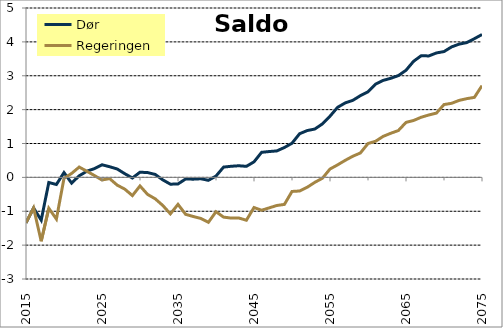
| Category | Dør | Regeringen |
|---|---|---|
| 2015-01-01 | -1.343 | -1.343 |
| 2016-01-01 | -0.903 | -0.903 |
| 2017-01-01 | -1.263 | -1.886 |
| 2018-01-01 | -0.152 | -0.91 |
| 2019-01-01 | -0.21 | -1.23 |
| 2020-01-01 | 0.142 | -0.028 |
| 2021-01-01 | -0.169 | 0.116 |
| 2022-01-01 | 0.046 | 0.305 |
| 2023-01-01 | 0.182 | 0.182 |
| 2024-01-01 | 0.257 | 0.055 |
| 2025-01-01 | 0.372 | -0.077 |
| 2026-01-01 | 0.314 | -0.036 |
| 2027-01-01 | 0.248 | -0.229 |
| 2028-01-01 | 0.108 | -0.348 |
| 2029-01-01 | -0.018 | -0.538 |
| 2030-01-01 | 0.153 | -0.253 |
| 2031-01-01 | 0.142 | -0.503 |
| 2032-01-01 | 0.087 | -0.632 |
| 2033-01-01 | -0.074 | -0.83 |
| 2034-01-01 | -0.201 | -1.077 |
| 2035-01-01 | -0.194 | -0.796 |
| 2036-01-01 | -0.047 | -1.09 |
| 2037-01-01 | -0.053 | -1.155 |
| 2038-01-01 | -0.041 | -1.212 |
| 2039-01-01 | -0.087 | -1.327 |
| 2040-01-01 | 0.039 | -1.014 |
| 2041-01-01 | 0.304 | -1.173 |
| 2042-01-01 | 0.328 | -1.202 |
| 2043-01-01 | 0.343 | -1.199 |
| 2044-01-01 | 0.326 | -1.265 |
| 2045-01-01 | 0.459 | -0.891 |
| 2046-01-01 | 0.74 | -0.97 |
| 2047-01-01 | 0.763 | -0.9 |
| 2048-01-01 | 0.781 | -0.83 |
| 2049-01-01 | 0.881 | -0.798 |
| 2050-01-01 | 1.008 | -0.416 |
| 2051-01-01 | 1.288 | -0.402 |
| 2052-01-01 | 1.382 | -0.292 |
| 2053-01-01 | 1.427 | -0.147 |
| 2054-01-01 | 1.578 | -0.026 |
| 2055-01-01 | 1.806 | 0.246 |
| 2056-01-01 | 2.068 | 0.369 |
| 2057-01-01 | 2.198 | 0.503 |
| 2058-01-01 | 2.273 | 0.624 |
| 2059-01-01 | 2.412 | 0.721 |
| 2060-01-01 | 2.524 | 0.999 |
| 2061-01-01 | 2.754 | 1.067 |
| 2062-01-01 | 2.863 | 1.211 |
| 2063-01-01 | 2.925 | 1.302 |
| 2064-01-01 | 3.005 | 1.383 |
| 2065-01-01 | 3.162 | 1.623 |
| 2066-01-01 | 3.427 | 1.68 |
| 2067-01-01 | 3.591 | 1.775 |
| 2068-01-01 | 3.585 | 1.842 |
| 2069-01-01 | 3.673 | 1.897 |
| 2070-01-01 | 3.714 | 2.149 |
| 2071-01-01 | 3.852 | 2.186 |
| 2072-01-01 | 3.934 | 2.274 |
| 2073-01-01 | 3.979 | 2.324 |
| 2074-01-01 | 4.094 | 2.362 |
| 2075-01-01 | 4.217 | 2.708 |